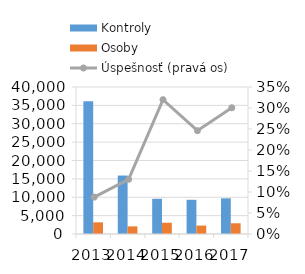
| Category | Kontroly | Osoby |
|---|---|---|
| 2013.0 | 36101 | 3170 |
| 2014.0 | 15911 | 2072 |
| 2015.0 | 9583 | 3065 |
| 2016.0 | 9308 | 2290 |
| 2017.0 | 9707 | 2918 |